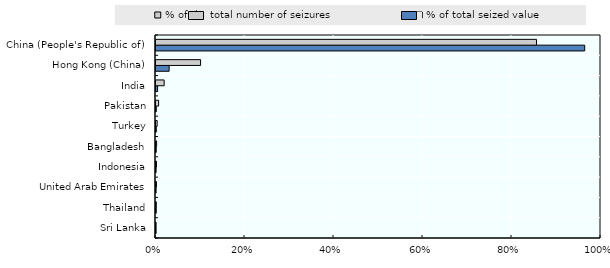
| Category | % of total seized value | % of the total number of seizures |
|---|---|---|
| Sri Lanka | 0 | 0 |
| Thailand | 0 | 0.001 |
| United Arab Emirates | 0 | 0.001 |
| Indonesia | 0 | 0.001 |
| Bangladesh | 0 | 0.001 |
| Turkey | 0.001 | 0.003 |
| Pakistan | 0.001 | 0.006 |
| India | 0.004 | 0.018 |
| Hong Kong (China) | 0.03 | 0.1 |
| China (People's Republic of) | 0.963 | 0.855 |